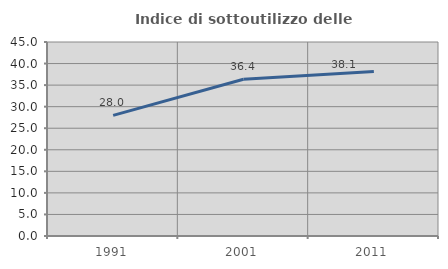
| Category | Indice di sottoutilizzo delle abitazioni  |
|---|---|
| 1991.0 | 27.972 |
| 2001.0 | 36.364 |
| 2011.0 | 38.129 |